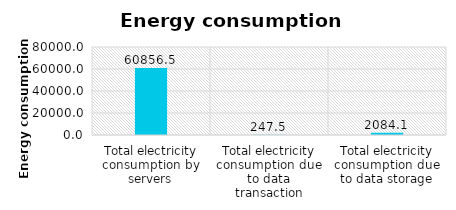
| Category | Series 0 |
|---|---|
| Total electricity consumption by servers | 60856.486 |
| Total electricity consumption due to data transaction | 247.5 |
| Total electricity consumption due to data storage | 2084.062 |